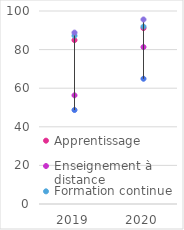
| Category | Apprentissage | Enseignement à distance | Formation continue | Individuel | Scolaire |
|---|---|---|---|---|---|
| 2019.0 | 84.9 | 56.3 | 87.2 | 48.7 | 88.8 |
| 2020.0 | 91.1 | 81.3 | 91.9 | 64.9 | 95.6 |